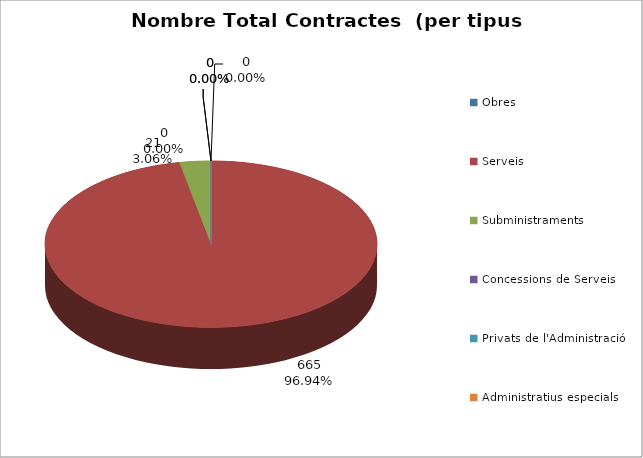
| Category | Nombre Total Contractes |
|---|---|
| Obres | 0 |
| Serveis | 665 |
| Subministraments | 21 |
| Concessions de Serveis | 0 |
| Privats de l'Administració | 0 |
| Administratius especials | 0 |